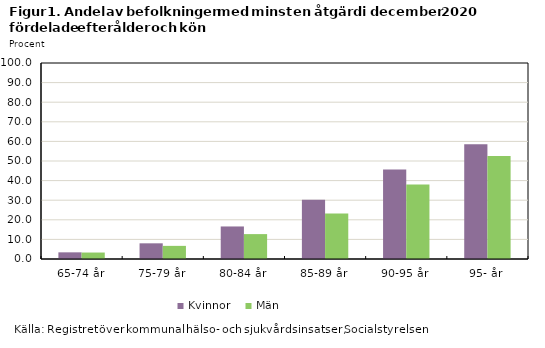
| Category | Kvinnor | Män |
|---|---|---|
| 65-74 år | 3.4 | 3.3 |
| 75-79 år | 8 | 6.7 |
| 80-84 år | 16.6 | 12.7 |
| 85-89 år | 30.2 | 23.2 |
| 90-95 år | 45.7 | 38 |
| 95- år | 58.6 | 52.6 |